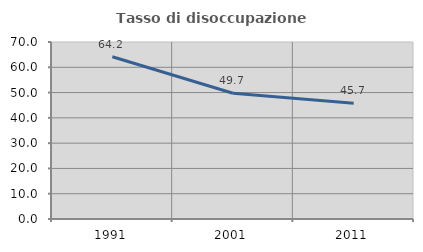
| Category | Tasso di disoccupazione giovanile  |
|---|---|
| 1991.0 | 64.169 |
| 2001.0 | 49.718 |
| 2011.0 | 45.736 |